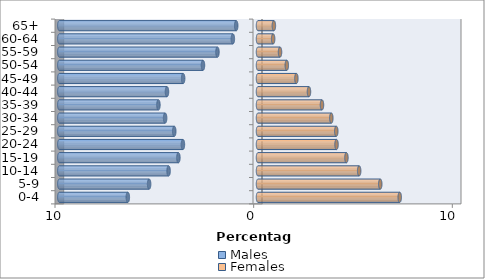
| Category | Males | Females |
|---|---|---|
| 0-4 | -6.553 | 7.134 |
| 5-9 | -5.481 | 6.154 |
| 10-14 | -4.501 | 5.092 |
| 15-19 | -4.007 | 4.451 |
| 20-24 | -3.78 | 3.952 |
| 25-29 | -4.215 | 3.94 |
| 30-34 | -4.675 | 3.691 |
| 35-39 | -5.012 | 3.22 |
| 40-44 | -4.582 | 2.566 |
| 45-49 | -3.768 | 1.932 |
| 50-54 | -2.77 | 1.45 |
| 55-59 | -2.042 | 1.108 |
| 60-64 | -1.266 | 0.762 |
| 65+ | -1.097 | 0.799 |